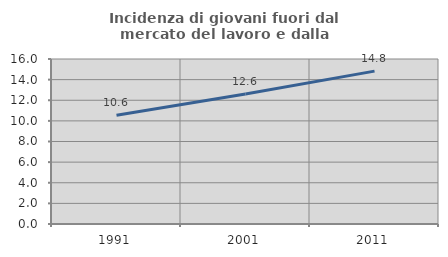
| Category | Incidenza di giovani fuori dal mercato del lavoro e dalla formazione  |
|---|---|
| 1991.0 | 10.556 |
| 2001.0 | 12.609 |
| 2011.0 | 14.825 |